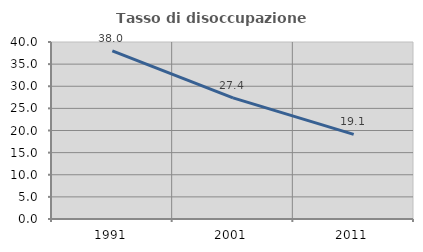
| Category | Tasso di disoccupazione giovanile  |
|---|---|
| 1991.0 | 38.017 |
| 2001.0 | 27.381 |
| 2011.0 | 19.118 |